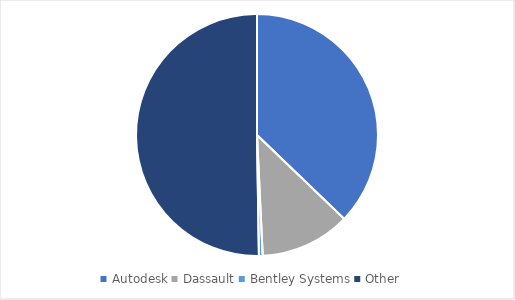
| Category | Series 0 |
|---|---|
| Autodesk | 0.37 |
| Dassault | 0.12 |
| Bentley Systems | 0.005 |
| Other  | 0.5 |